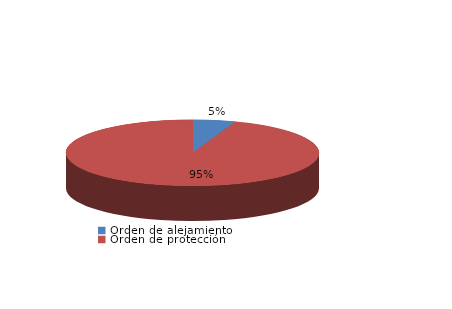
| Category | Series 0 |
|---|---|
| Orden de alejamiento | 7 |
| Orden de protección | 122 |